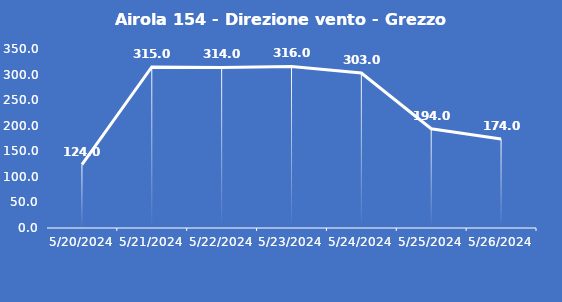
| Category | Airola 154 - Direzione vento - Grezzo (°N) |
|---|---|
| 5/20/24 | 124 |
| 5/21/24 | 315 |
| 5/22/24 | 314 |
| 5/23/24 | 316 |
| 5/24/24 | 303 |
| 5/25/24 | 194 |
| 5/26/24 | 174 |